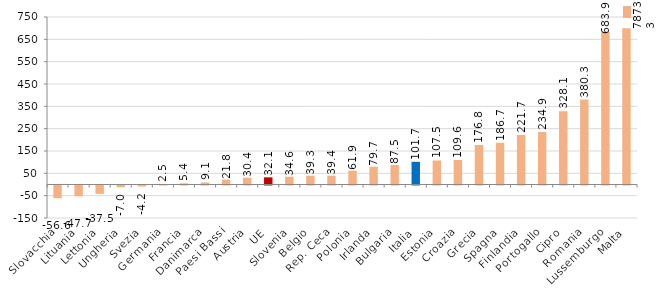
| Category | Series 0 |
|---|---|
| Slovacchia | -56.585 |
| Lituania | -47.724 |
| Lettonia | -37.5 |
| Ungheria | -7.025 |
| Svezia | -4.216 |
| Germania | 2.482 |
| Francia | 5.357 |
| Danimarca | 9.088 |
| Paesi Bassi | 21.803 |
| Austria | 30.42 |
| UE | 32.089 |
| Slovenia | 34.615 |
| Belgio | 39.294 |
| Rep. Ceca | 39.425 |
| Polonia | 61.861 |
| Irlanda | 79.656 |
| Bulgaria | 87.479 |
| Italia | 101.69 |
| Estonia | 107.529 |
| Croazia | 109.566 |
| Grecia | 176.812 |
| Spagna | 186.737 |
| Finlandia | 221.68 |
| Portogallo | 234.884 |
| Cipro | 328.055 |
| Romania | 380.266 |
| Lussemburgo | 683.856 |
| Malta | 700 |